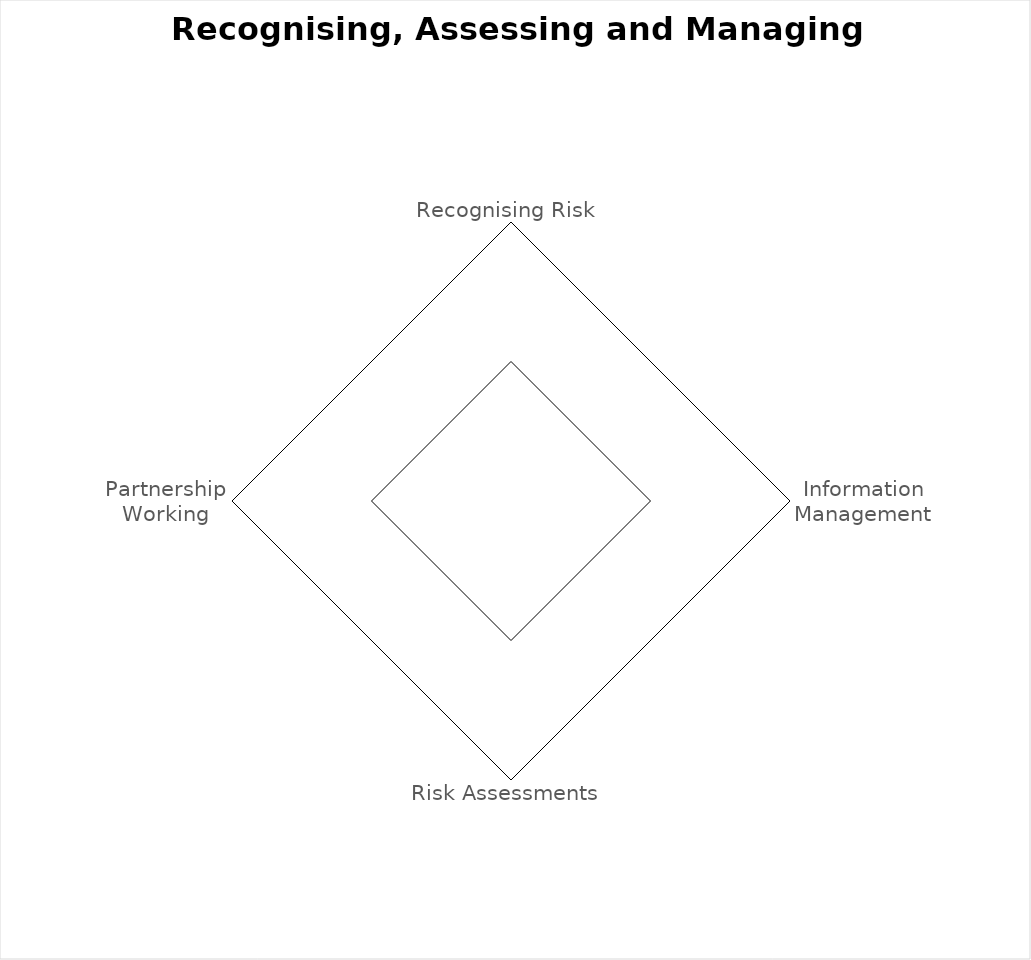
| Category | Series 0 |
|---|---|
| Recognising Risk | 0 |
| Information Management | 0 |
| Risk Assessments | 0 |
| Partnership Working | 0 |